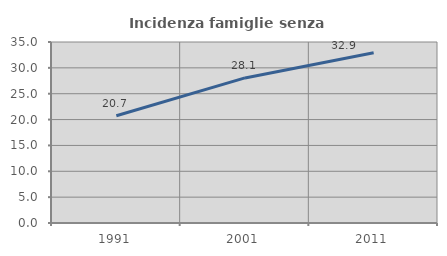
| Category | Incidenza famiglie senza nuclei |
|---|---|
| 1991.0 | 20.743 |
| 2001.0 | 28.056 |
| 2011.0 | 32.924 |